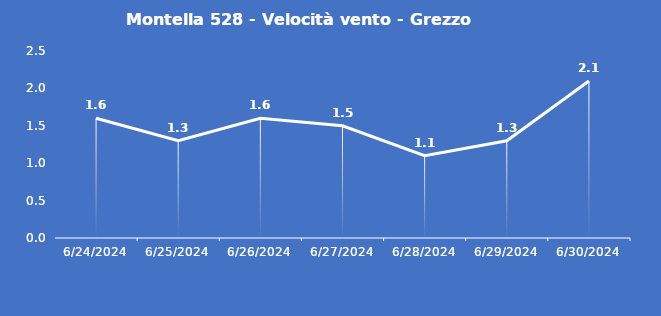
| Category | Montella 528 - Velocità vento - Grezzo (m/s) |
|---|---|
| 6/24/24 | 1.6 |
| 6/25/24 | 1.3 |
| 6/26/24 | 1.6 |
| 6/27/24 | 1.5 |
| 6/28/24 | 1.1 |
| 6/29/24 | 1.3 |
| 6/30/24 | 2.1 |